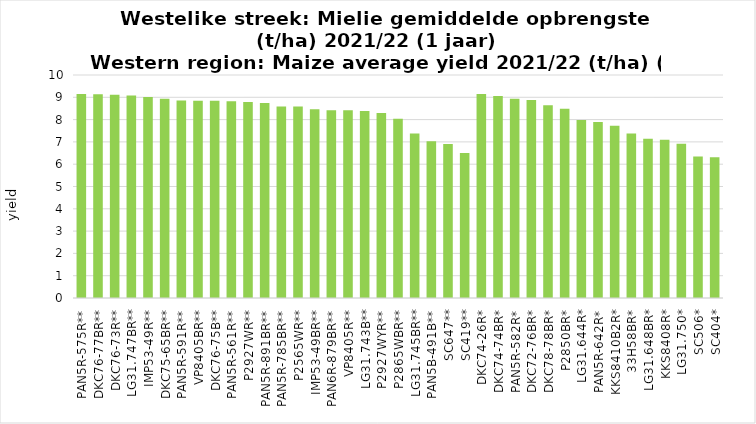
| Category | Series 0 |
|---|---|
| PAN5R-575R** | 9.149 |
| DKC76-77BR** | 9.136 |
| DKC76-73R** | 9.109 |
| LG31.747BR** | 9.076 |
| IMP53-49R** | 9.012 |
| DKC75-65BR** | 8.934 |
| PAN5R-591R** | 8.858 |
| VP8405BR** | 8.846 |
| DKC76-75B** | 8.84 |
| PAN5R-561R** | 8.818 |
| P2927WR** | 8.787 |
| PAN5R-891BR** | 8.744 |
| PAN5R-785BR** | 8.591 |
| P2565WR** | 8.59 |
| IMP53-49BR** | 8.469 |
| PAN6R-879BR** | 8.419 |
| VP8405R** | 8.416 |
| LG31.743B** | 8.39 |
| P2927WYR** | 8.294 |
| P2865WBR** | 8.034 |
| LG31.745BR** | 7.371 |
| PAN5B-491B** | 7.026 |
| SC647** | 6.906 |
| SC419** | 6.504 |
| DKC74-26R* | 9.151 |
| DKC74-74BR* | 9.06 |
| PAN5R-582R* | 8.932 |
| DKC72-76BR* | 8.877 |
| DKC78-78BR* | 8.643 |
| P2850BR* | 8.481 |
| LG31.644R* | 7.987 |
| PAN5R-642R* | 7.888 |
| KKS8410B2R* | 7.728 |
| 33H58BR* | 7.374 |
| LG31.648BR* | 7.138 |
| KKS8408R* | 7.096 |
| LG31.750* | 6.919 |
| SC506* | 6.348 |
| SC404* | 6.317 |